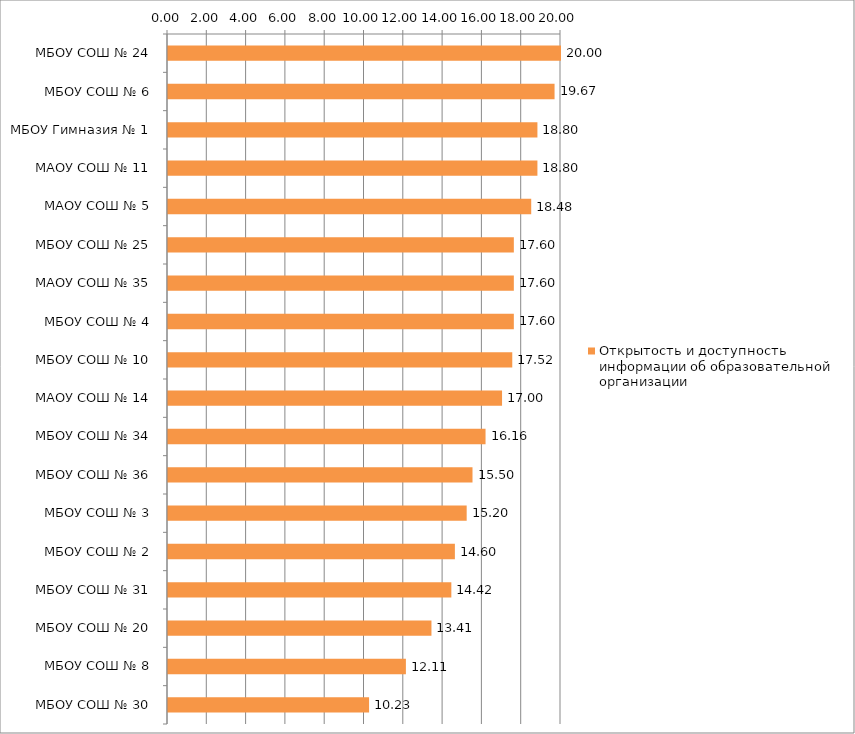
| Category | Открытость и доступность информации об образовательной организации |
|---|---|
| МБОУ СОШ № 24 | 20 |
| МБОУ СОШ № 6 | 19.672 |
| МБОУ Гимназия № 1 | 18.8 |
| МАОУ СОШ № 11 | 18.8 |
| МАОУ СОШ № 5 | 18.484 |
| МБОУ СОШ № 25 | 17.6 |
| МАОУ СОШ № 35 | 17.6 |
| МБОУ СОШ № 4 | 17.6 |
| МБОУ СОШ № 10 | 17.52 |
| МАОУ СОШ № 14 | 17 |
| МБОУ СОШ № 34 | 16.16 |
| МБОУ СОШ № 36 | 15.496 |
| МБОУ СОШ № 3 | 15.2 |
| МБОУ СОШ № 2 | 14.6 |
| МБОУ СОШ № 31 | 14.42 |
| МБОУ СОШ № 20 | 13.407 |
| МБОУ СОШ № 8 | 12.107 |
| МБОУ СОШ № 30 | 10.233 |